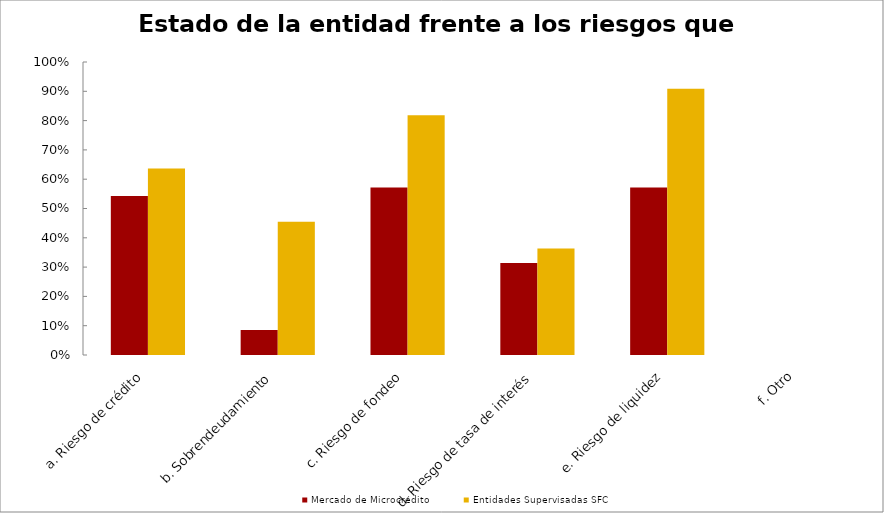
| Category | Mercado de Microcrédito | Entidades Supervisadas SFC |
|---|---|---|
| a. Riesgo de crédito | 0.543 | 0.636 |
| b. Sobrendeudamiento | 0.086 | 0.455 |
| c. Riesgo de fondeo | 0.571 | 0.818 |
| d. Riesgo de tasa de interés | 0.314 | 0.364 |
| e. Riesgo de liquidez | 0.571 | 0.909 |
| f. Otro | 0 | 0 |